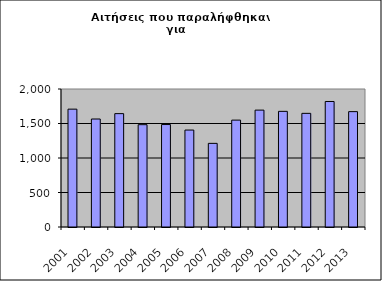
| Category | Series 0 |
|---|---|
| 2001.0 | 1708 |
| 2002.0 | 1565 |
| 2003.0 | 1643 |
| 2004.0 | 1483 |
| 2005.0 | 1485 |
| 2006.0 | 1405 |
| 2007.0 | 1212 |
| 2008.0 | 1549 |
| 2009.0 | 1694 |
| 2010.0 | 1676 |
| 2011.0 | 1647 |
| 2012.0 | 1819 |
| 2013.0 | 1672 |